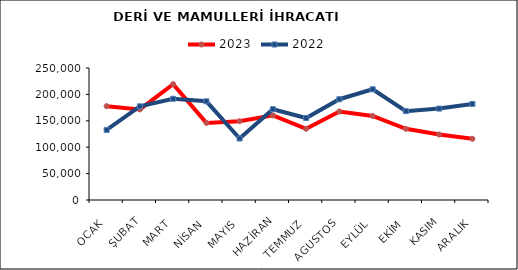
| Category | 2023 | 2022 |
|---|---|---|
| OCAK | 177753.894 | 132687.614 |
| ŞUBAT | 171506.636 | 177382.253 |
| MART | 219464.281 | 191674.088 |
| NİSAN | 145998.792 | 186942.256 |
| MAYIS | 149296.722 | 116430.738 |
| HAZİRAN | 160250.142 | 171936.318 |
| TEMMUZ | 134900.309 | 155304.098 |
| AGUSTOS | 167678.588 | 190866.799 |
| EYLÜL | 159263.618 | 209721.931 |
| EKİM | 134792.035 | 168268.209 |
| KASIM | 124119.576 | 173099.926 |
| ARALIK | 115970.35 | 181956.933 |